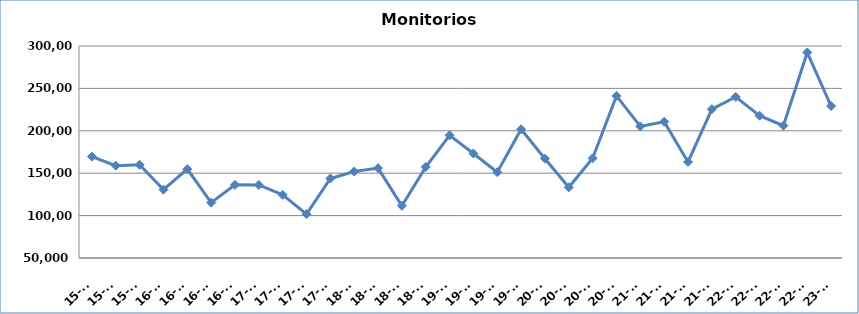
| Category | Monitorios ingresados |
|---|---|
| 15-T2 | 169612 |
| 15-T3 | 158859 |
| 15-T4 | 159890 |
| 16-T1 | 130680 |
| 16-T2 | 154860 |
| 16-T3 | 115269 |
| 16-T4 | 136245 |
| 17-T1 | 136155 |
| 17-T2 | 124382 |
| 17-T3 | 101751 |
| 17-T4 | 143788 |
| 18-T1 | 151974 |
| 18-T2 | 155991 |
| 18-T3 | 111544 |
| 18-T4 | 157337 |
| 19-T1 | 194715 |
| 19-T2 | 173225 |
| 19-T3 | 151156 |
| 19-T4 | 201895 |
| 20-T1 | 167095 |
| 20-T2 | 133351 |
| 20-T3 | 167630 |
| 20-T4 | 241119 |
| 21-T1 | 205212 |
| 21-T2 | 210679 |
| 21-T3 | 163259 |
| 21-T4 | 225536 |
| 22-T1 | 239972 |
| 22-T2 | 217801 |
| 22-T3 | 206093 |
| 22-T4 | 292388 |
| 23-T1 | 229190 |